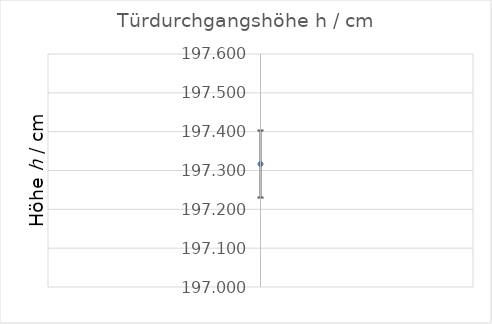
| Category | Höhe |
|---|---|
| 0 | 197.317 |